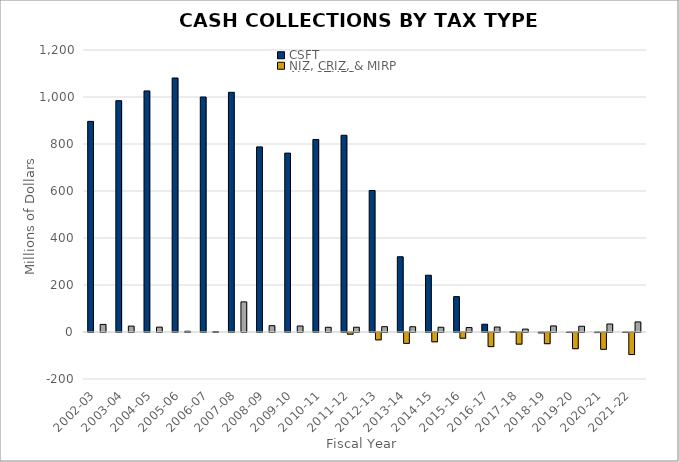
| Category | CSFT | NIZ, CRIZ, & MIRP | ALL OTHER |
|---|---|---|---|
| 2002-03 | 896.329 | 0 | 32.318 |
| 2003-04 | 984.295 | 0 | 25.018 |
| 2004-05 | 1025.904 | 0 | 20.679 |
| 2005-06 | 1080.874 | 0 | 3.202 |
| 2006-07 | 999.954 | 0 | 1.851 |
| 2007-08 | 1019.942 | 0 | 128.237 |
| 2008-09 | 787.704 | 0 | 26.896 |
| 2009-10 | 761.188 | 0 | 25.508 |
| 2010-11 | 819.363 | 0 | 20.154 |
| 2011-12 | 837.243 | -7.113 | 20.329 |
| 2012-13 | 602.249 | -31.288 | 22.614 |
| 2013-14 | 320.207 | -46.23 | 22.361 |
| 2014-15 | 241.587 | -39.621 | 20.234 |
| 2015-16 | 150.58 | -24.262 | 18.916 |
| 2016-17 | 33.051 | -60.009 | 21.181 |
| 2017-18 | 1.822 | -49.526 | 12.304 |
| 2018-19 | -1.254 | -47.66 | 25.906 |
| 2019-20 | 0.078 | -68.895 | 24.513 |
| 2020-21 | -0.221 | -71.602 | 33.918 |
| 2021-22 | 0.149 | -93.797 | 42.789 |